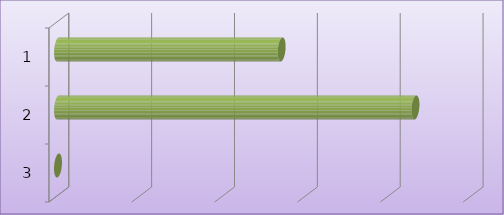
| Category | Series 0 |
|---|---|
| 0 | 13496969 |
| 1 | 21571988 |
| 2 | 0 |